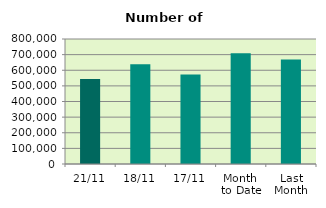
| Category | Series 0 |
|---|---|
| 21/11 | 543632 |
| 18/11 | 637804 |
| 17/11 | 572616 |
| Month 
to Date | 708321.333 |
| Last
Month | 669366.857 |